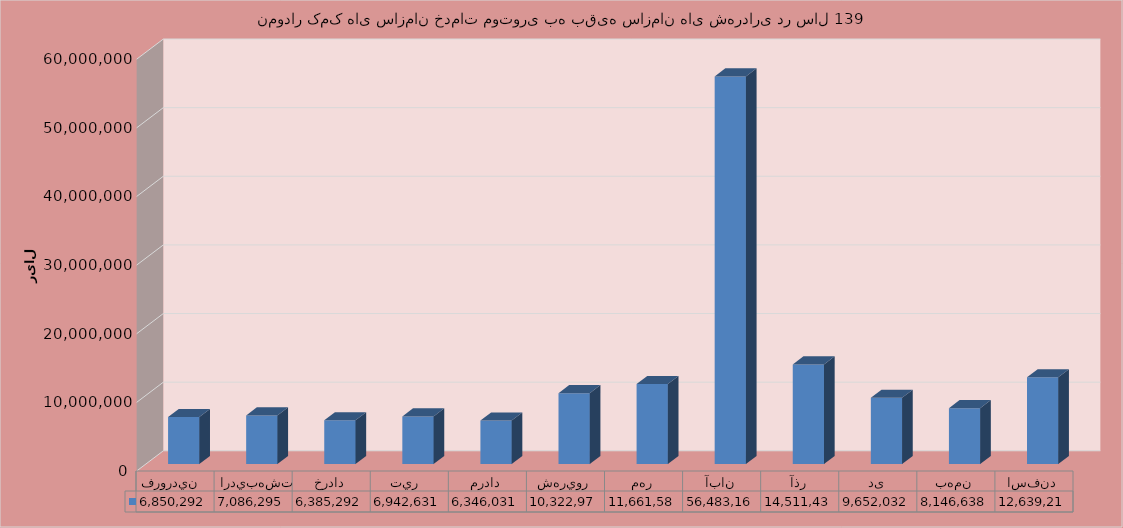
| Category |   |
|---|---|
| فروردين  | 6850292 |
| ارديبهشت | 7086295 |
| خرداد | 6385292 |
| تير  | 6942631 |
| مرداد | 6346031 |
| شهريور | 10322975 |
| مهر | 11661583 |
| آبان | 56483169 |
| آذر | 14511434 |
| دی | 9652032 |
| بهمن | 8146638 |
| اسفند | 12639213 |